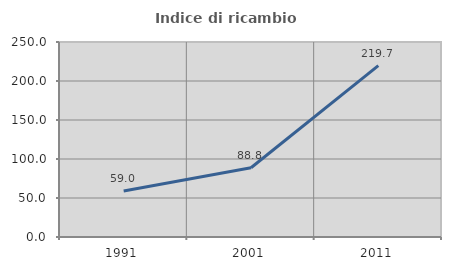
| Category | Indice di ricambio occupazionale  |
|---|---|
| 1991.0 | 58.955 |
| 2001.0 | 88.812 |
| 2011.0 | 219.742 |